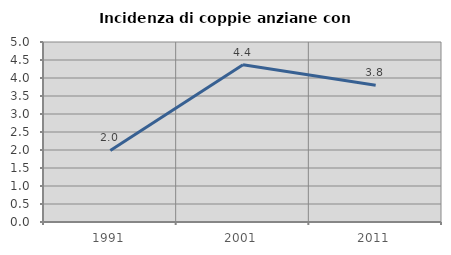
| Category | Incidenza di coppie anziane con figli |
|---|---|
| 1991.0 | 1.987 |
| 2001.0 | 4.365 |
| 2011.0 | 3.797 |